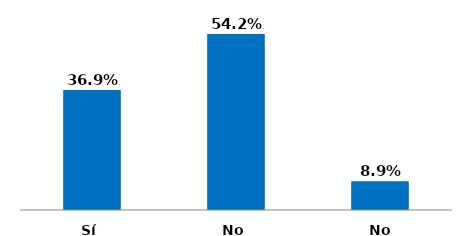
| Category | Series 0 |
|---|---|
| Sí | 0.369 |
| No | 0.542 |
| No responde | 0.089 |